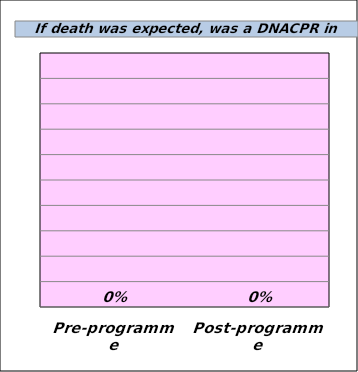
| Category | Yes % |
|---|---|
| Pre-programme | 0 |
| Post-programme | 0 |